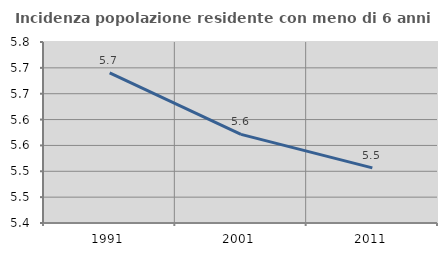
| Category | Incidenza popolazione residente con meno di 6 anni |
|---|---|
| 1991.0 | 5.69 |
| 2001.0 | 5.571 |
| 2011.0 | 5.507 |